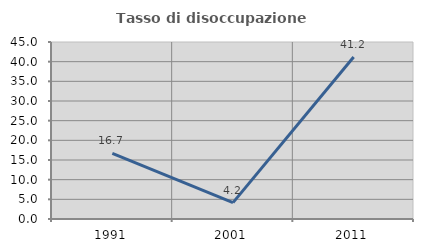
| Category | Tasso di disoccupazione giovanile  |
|---|---|
| 1991.0 | 16.667 |
| 2001.0 | 4.167 |
| 2011.0 | 41.176 |